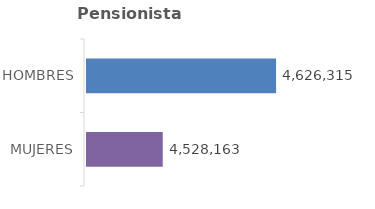
| Category | Series 0 | Series 1 |
|---|---|---|
| MUJERES | 4528163 |  |
| HOMBRES | 4626315 |  |